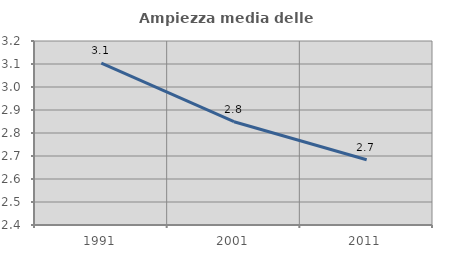
| Category | Ampiezza media delle famiglie |
|---|---|
| 1991.0 | 3.104 |
| 2001.0 | 2.849 |
| 2011.0 | 2.684 |